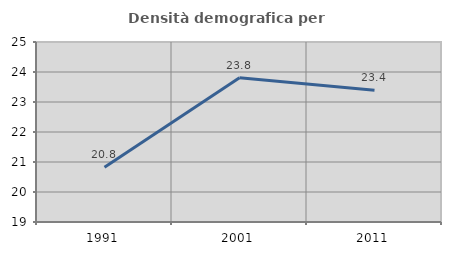
| Category | Densità demografica |
|---|---|
| 1991.0 | 20.825 |
| 2001.0 | 23.811 |
| 2011.0 | 23.392 |